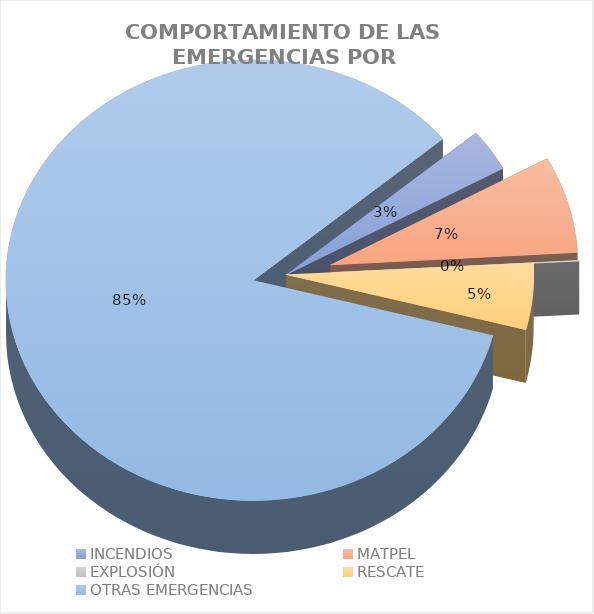
| Category | Incidentes |
|---|---|
| INCENDIOS | 0.031 |
| MATPEL | 0.071 |
| EXPLOSIÓN | 0.001 |
| RESCATE | 0.049 |
| OTRAS EMERGENCIAS | 0.849 |